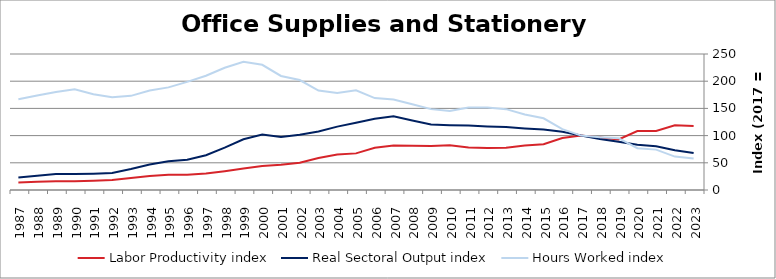
| Category | Labor Productivity index | Real Sectoral Output index | Hours Worked index |
|---|---|---|---|
| 2023.0 | 117.738 | 67.932 | 57.697 |
| 2022.0 | 118.849 | 72.943 | 61.374 |
| 2021.0 | 108.585 | 80.597 | 74.224 |
| 2020.0 | 108.428 | 83.248 | 76.777 |
| 2019.0 | 93.042 | 88.71 | 95.344 |
| 2018.0 | 96.636 | 93.829 | 97.096 |
| 2017.0 | 100 | 100 | 100 |
| 2016.0 | 95.673 | 106.964 | 111.802 |
| 2015.0 | 84.262 | 111.106 | 131.858 |
| 2014.0 | 81.616 | 113.268 | 138.782 |
| 2013.0 | 77.821 | 115.664 | 148.629 |
| 2012.0 | 77.156 | 116.894 | 151.502 |
| 2011.0 | 78.177 | 118.453 | 151.519 |
| 2010.0 | 82.067 | 119.253 | 145.311 |
| 2009.0 | 80.916 | 120.282 | 148.651 |
| 2008.0 | 81.128 | 127.924 | 157.682 |
| 2007.0 | 81.603 | 135.727 | 166.327 |
| 2006.0 | 77.549 | 131.076 | 169.024 |
| 2005.0 | 67.325 | 123.486 | 183.416 |
| 2004.0 | 65.356 | 116.473 | 178.214 |
| 2003.0 | 58.882 | 107.579 | 182.704 |
| 2002.0 | 50.289 | 101.636 | 202.103 |
| 2001.0 | 46.546 | 97.56 | 209.599 |
| 2000.0 | 44.227 | 101.808 | 230.193 |
| 1999.0 | 39.538 | 93.211 | 235.752 |
| 1998.0 | 34.62 | 77.809 | 224.754 |
| 1997.0 | 30.451 | 63.933 | 209.953 |
| 1996.0 | 28.013 | 55.66 | 198.698 |
| 1995.0 | 27.945 | 52.723 | 188.664 |
| 1994.0 | 25.602 | 46.81 | 182.832 |
| 1993.0 | 22.238 | 38.49 | 173.083 |
| 1992.0 | 18.279 | 31.188 | 170.624 |
| 1991.0 | 17.1 | 30.082 | 175.918 |
| 1990.0 | 15.949 | 29.559 | 185.338 |
| 1989.0 | 16.245 | 29.294 | 180.326 |
| 1988.0 | 14.949 | 25.995 | 173.894 |
| 1987.0 | 13.741 | 22.899 | 166.65 |